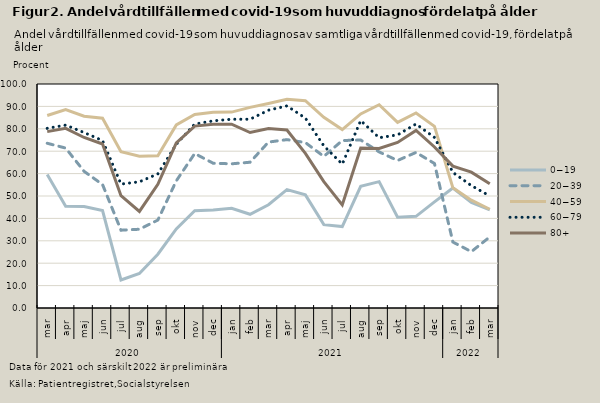
| Category | 0−19 | 20−39 | 40−59 | 60−79 | 80+ |
|---|---|---|---|---|---|
| 0 | 59.574 | 73.538 | 85.917 | 80.196 | 78.74 |
| 1 | 45.455 | 71.393 | 88.608 | 81.643 | 80.191 |
| 2 | 45.27 | 61.005 | 85.601 | 78.336 | 76.122 |
| 3 | 43.478 | 55.119 | 84.721 | 74.749 | 73.229 |
| 4 | 12.5 | 34.737 | 69.767 | 55.323 | 50.119 |
| 5 | 15.385 | 35.156 | 67.757 | 56.338 | 43.103 |
| 6 | 24 | 39.252 | 67.949 | 59.864 | 55.249 |
| 7 | 35.294 | 56.771 | 81.725 | 73.102 | 73.739 |
| 8 | 43.448 | 68.966 | 86.361 | 82.097 | 81.213 |
| 9 | 43.787 | 64.623 | 87.407 | 83.541 | 82.036 |
| 10 | 44.538 | 64.371 | 87.445 | 84.268 | 82.044 |
| 11 | 41.837 | 65.072 | 89.556 | 84.276 | 78.326 |
| 12 | 46.087 | 74.07 | 91.304 | 88.309 | 80.145 |
| 13 | 52.857 | 75.168 | 93.16 | 90.227 | 79.476 |
| 14 | 50.495 | 73.846 | 92.548 | 84.778 | 69.048 |
| 15 | 37.209 | 67.672 | 85.156 | 72.384 | 56.436 |
| 16 | 36.364 | 74.757 | 79.646 | 64.22 | 46 |
| 17 | 54.348 | 75 | 86.626 | 83.681 | 71.429 |
| 18 | 56.41 | 69.672 | 90.761 | 76.01 | 71.26 |
| 19 | 40.541 | 65.854 | 82.845 | 77.303 | 73.913 |
| 20 | 40.909 | 69.458 | 87.043 | 82.136 | 79.245 |
| 21 | 47.368 | 64.516 | 81.074 | 76.151 | 71.881 |
| 22 | 53.568 | 29.438 | 53.63 | 60.517 | 63.351 |
| 23 | 47.089 | 25.163 | 48.129 | 54.653 | 60.658 |
| 24 | 43.86 | 31.72 | 44.089 | 50 | 55.479 |